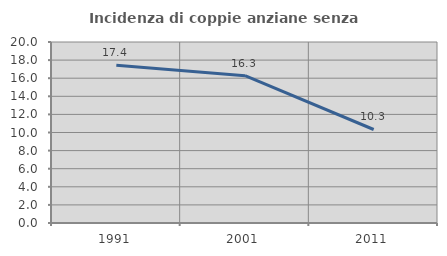
| Category | Incidenza di coppie anziane senza figli  |
|---|---|
| 1991.0 | 17.427 |
| 2001.0 | 16.279 |
| 2011.0 | 10.332 |